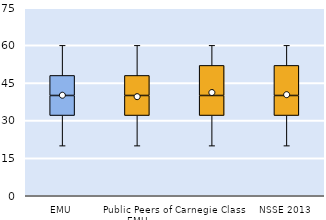
| Category | 25th | 50th | 75th |
|---|---|---|---|
| EMU | 32 | 8 | 8 |
| Public Peers of EMU | 32 | 8 | 8 |
| Carnegie Class | 32 | 8 | 12 |
| NSSE 2013 | 32 | 8 | 12 |